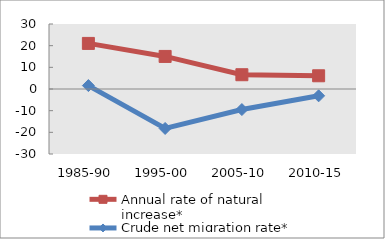
| Category | Annual rate of natural increase* | Crude net migration rate* |
|---|---|---|
| 1985-90 | 21.043 | 1.576 |
| 1995-00 | 15.035 | -18.211 |
| 2005-10 | 6.587 | -9.486 |
| 2010-15 | 6.103 | -3.151 |